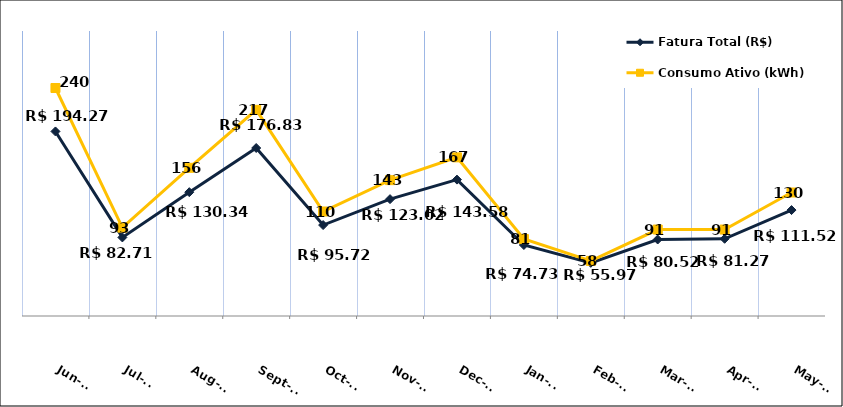
| Category | Fatura Total (R$) |
|---|---|
| 2023-06-01 | 194.27 |
| 2023-07-01 | 82.71 |
| 2023-08-01 | 130.34 |
| 2023-09-01 | 176.83 |
| 2023-10-01 | 95.72 |
| 2023-11-01 | 123.02 |
| 2023-12-01 | 143.58 |
| 2024-01-01 | 74.73 |
| 2024-02-01 | 55.97 |
| 2024-03-01 | 80.52 |
| 2024-04-01 | 81.27 |
| 2024-05-01 | 111.52 |